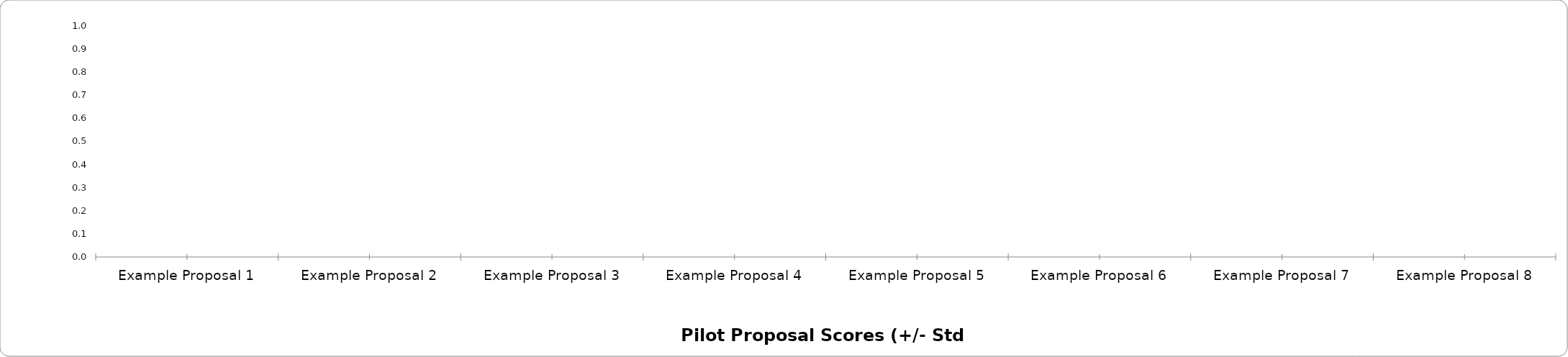
| Category | Series 0 |
|---|---|
| Example Proposal 1 | 0 |
| Example Proposal 2 | 0 |
| Example Proposal 3 | 0 |
| Example Proposal 4 | 0 |
| Example Proposal 5 | 0 |
| Example Proposal 6 | 0 |
| Example Proposal 7 | 0 |
| Example Proposal 8 | 0 |